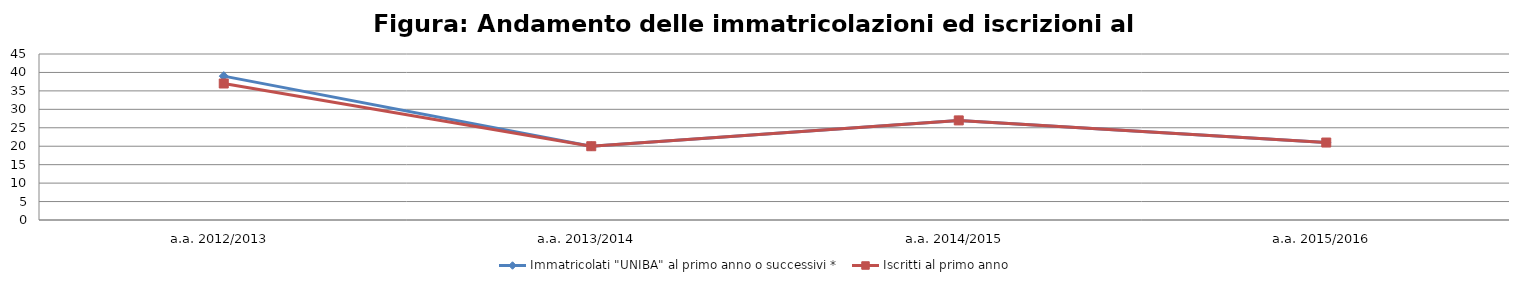
| Category | Immatricolati "UNIBA" al primo anno o successivi * | Iscritti al primo anno  |
|---|---|---|
| a.a. 2012/2013 | 39 | 37 |
| a.a. 2013/2014 | 20 | 20 |
| a.a. 2014/2015 | 27 | 27 |
| a.a. 2015/2016 | 21 | 21 |